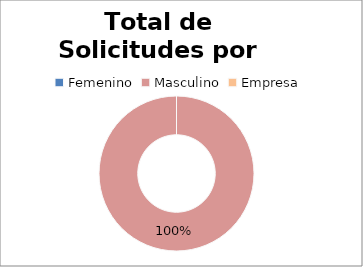
| Category | Series 0 |
|---|---|
| 0 | 0 |
| 1 | 3 |
| 2 | 0 |